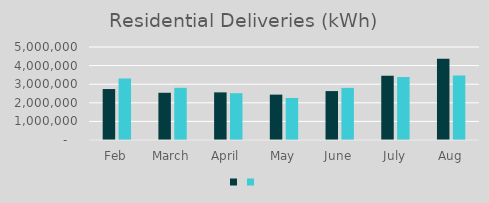
| Category | Series 1 | Series 0 |
|---|---|---|
| Feb | 2739688 | 3307618 |
| March | 2538769 | 2805250 |
| April  | 2560197 | 2517652 |
| May | 2439036 | 2261207 |
| June | 2629934 | 2802052 |
| July | 3456641 | 3385366 |
| Aug | 4364840 | 3470448 |